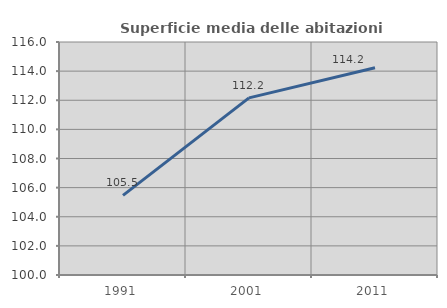
| Category | Superficie media delle abitazioni occupate |
|---|---|
| 1991.0 | 105.468 |
| 2001.0 | 112.162 |
| 2011.0 | 114.237 |